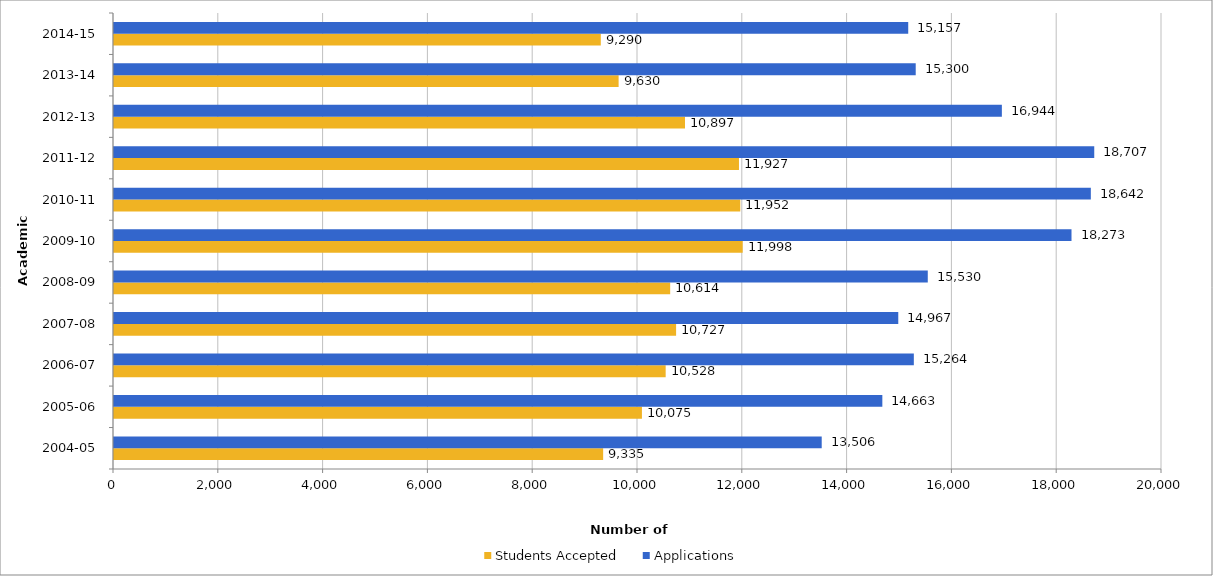
| Category | Students Accepted | Applications |
|---|---|---|
| 2004-05 | 9335 | 13506 |
| 2005-06 | 10075 | 14663 |
| 2006-07 | 10528 | 15264 |
| 2007-08 | 10727 | 14967 |
| 2008-09 | 10614 | 15530 |
| 2009-10 | 11998 | 18273 |
| 2010-11 | 11952 | 18642 |
| 2011-12 | 11927 | 18707 |
| 2012-13 | 10897 | 16944 |
| 2013-14 | 9630 | 15300 |
| 2014-15 | 9290 | 15157 |